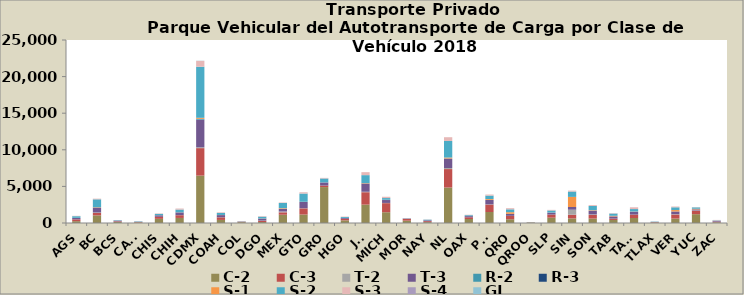
| Category | C-2 | C-3 | T-2 | T-3 | R-2 | R-3 | S-1 | S-2 | S-3 | S-4 | GI |
|---|---|---|---|---|---|---|---|---|---|---|---|
| AGS | 252 | 245 | 4 | 186 | 5 | 0 | 10 | 228 | 49 | 1 | 0 |
| BC | 1042 | 324 | 72 | 662 | 40 | 4 | 36 | 1055 | 92 | 3 | 1 |
| BCS | 150 | 79 | 2 | 90 | 1 | 6 | 1 | 61 | 20 | 0 | 0 |
| CAMP | 84 | 56 | 12 | 30 | 0 | 0 | 0 | 49 | 12 | 0 | 0 |
| CHIS | 568 | 273 | 4 | 207 | 5 | 0 | 10 | 176 | 59 | 0 | 0 |
| CHIH | 691 | 375 | 14 | 366 | 0 | 1 | 12 | 378 | 138 | 1 | 3 |
| CDMX | 6473 | 3757 | 109 | 3780 | 96 | 17 | 138 | 6977 | 796 | 6 | 19 |
| COAH | 419 | 355 | 14 | 291 | 3 | 1 | 16 | 278 | 77 | 1 | 0 |
| COL | 115 | 47 | 10 | 29 | 2 | 1 | 10 | 31 | 24 | 0 | 0 |
| DGO | 136 | 171 | 27 | 270 | 1 | 0 | 18 | 240 | 71 | 4 | 0 |
| MEX | 1129 | 330 | 113 | 363 | 19 | 3 | 76 | 707 | 60 | 0 | 2 |
| GTO | 1155 | 844 | 23 | 847 | 2 | 0 | 26 | 1128 | 171 | 2 | 5 |
| GRO | 4909 | 206 | 0 | 426 | 4 | 1 | 0 | 538 | 80 | 0 | 1 |
| HGO | 358 | 216 | 1 | 123 | 0 | 0 | 3 | 122 | 55 | 0 | 0 |
| JAL | 2509 | 1698 | 61 | 1114 | 7 | 13 | 51 | 1086 | 406 | 2 | 1 |
| MICH | 1472 | 1242 | 27 | 397 | 9 | 4 | 23 | 234 | 176 | 0 | 1 |
| MOR | 319 | 247 | 2 | 47 | 3 | 1 | 0 | 24 | 20 | 0 | 0 |
| NAY | 122 | 132 | 0 | 109 | 0 | 0 | 4 | 88 | 27 | 0 | 0 |
| NL | 4842 | 2526 | 138 | 1287 | 13 | 10 | 125 | 2267 | 512 | 0 | 1 |
| OAX | 547 | 234 | 0 | 157 | 1 | 4 | 0 | 125 | 59 | 0 | 0 |
| PUE | 1503 | 1012 | 30 | 602 | 9 | 5 | 113 | 470 | 143 | 0 | 0 |
| QRO | 509 | 458 | 15 | 268 | 2 | 0 | 227 | 390 | 155 | 1 | 4 |
| QROO | 59 | 12 | 1 | 12 | 1 | 0 | 0 | 8 | 2 | 0 | 0 |
| SLP | 725 | 423 | 7 | 260 | 6 | 2 | 6 | 281 | 83 | 0 | 1 |
| SIN | 626 | 506 | 686 | 366 | 1 | 0 | 1382 | 730 | 125 | 1 | 2 |
| SON | 609 | 494 | 70 | 503 | 6 | 0 | 66 | 584 | 115 | 1 | 0 |
| TAB | 414 | 180 | 4 | 299 | 1 | 5 | 82 | 306 | 59 | 0 | 0 |
| TAMS | 686 | 456 | 7 | 395 | 4 | 2 | 21 | 334 | 237 | 6 | 0 |
| TLAX | 70 | 50 | 0 | 34 | 5 | 0 | 0 | 34 | 9 | 0 | 0 |
| VER | 606 | 552 | 47 | 370 | 4 | 0 | 191 | 375 | 107 | 0 | 0 |
| YUC | 1205 | 473 | 39 | 145 | 1 | 0 | 84 | 187 | 28 | 2 | 2 |
| ZAC | 101 | 83 | 6 | 102 | 0 | 1 | 2 | 61 | 63 | 0 | 0 |